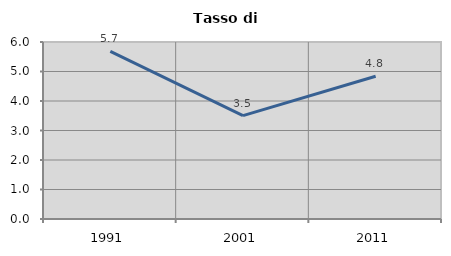
| Category | Tasso di disoccupazione   |
|---|---|
| 1991.0 | 5.679 |
| 2001.0 | 3.504 |
| 2011.0 | 4.839 |